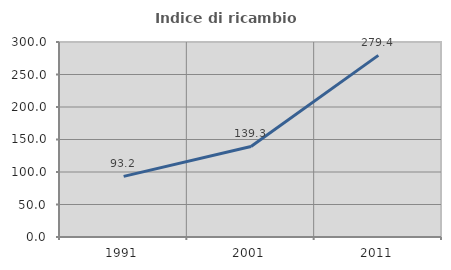
| Category | Indice di ricambio occupazionale  |
|---|---|
| 1991.0 | 93.213 |
| 2001.0 | 139.296 |
| 2011.0 | 279.377 |